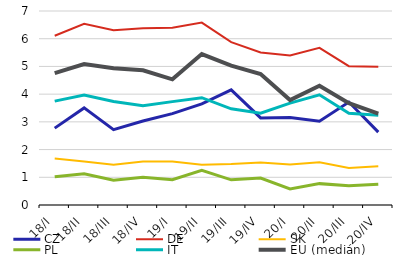
| Category | CZ | DE | SK | PL | IT | EU (medián) |
|---|---|---|---|---|---|---|
| 18/I | 2.774 | 6.105 | 1.68 | 1.016 | 3.747 | 4.757 |
| 18/II | 3.503 | 6.539 | 1.574 | 1.129 | 3.966 | 5.084 |
| 18/III | 2.717 | 6.304 | 1.448 | 0.891 | 3.736 | 4.931 |
| 18/IV | 3.03 | 6.378 | 1.568 | 1 | 3.583 | 4.86 |
| 19/I | 3.298 | 6.399 | 1.573 | 0.911 | 3.73 | 4.534 |
| 19/II | 3.65 | 6.583 | 1.453 | 1.256 | 3.873 | 5.447 |
| 19/III | 4.155 | 5.879 | 1.476 | 0.908 | 3.47 | 5.029 |
| 19/IV | 3.143 | 5.505 | 1.53 | 0.973 | 3.31 | 4.724 |
| 20/I | 3.158 | 5.397 | 1.461 | 0.579 | 3.675 | 3.786 |
| 20/II | 3.021 | 5.669 | 1.545 | 0.771 | 3.976 | 4.302 |
| 20/III | 3.714 | 5.009 | 1.339 | 0.697 | 3.313 | 3.671 |
| 20/IV | 2.63 | 4.992 | 1.398 | 0.75 | 3.243 | 3.293 |